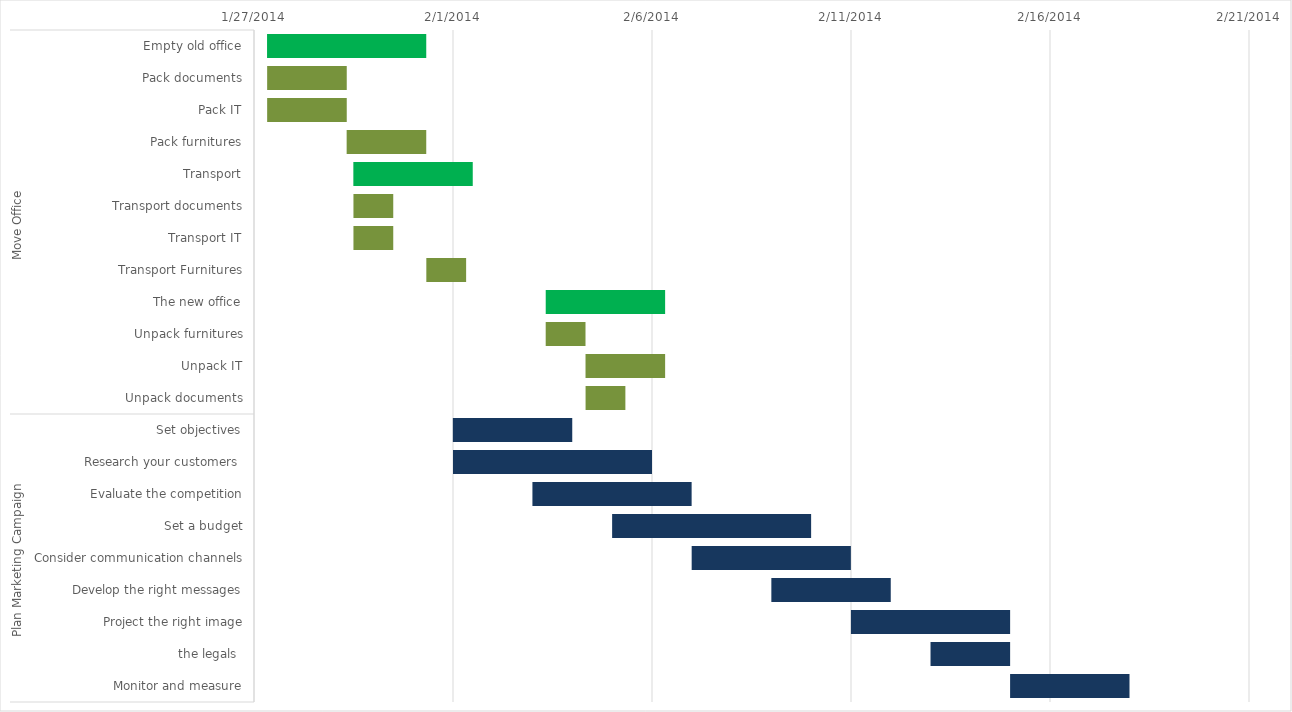
| Category | Start Date | duration |
|---|---|---|
| 0 | 1/27/14 | 4 |
| 1 | 1/27/14 | 2 |
| 2 | 1/27/14 | 2 |
| 3 | 1/29/14 | 2 |
| 4 | 1/29/14 | 3 |
| 5 | 1/29/14 | 1 |
| 6 | 1/29/14 | 1 |
| 7 | 1/31/14 | 1 |
| 8 | 2/3/14 | 3 |
| 9 | 2/3/14 | 1 |
| 10 | 2/4/14 | 2 |
| 11 | 2/4/14 | 1 |
| 12 | 2/1/14 | 3 |
| 13 | 2/1/14 | 5 |
| 14 | 2/3/14 | 4 |
| 15 | 2/5/14 | 5 |
| 16 | 2/7/14 | 4 |
| 17 | 2/9/14 | 3 |
| 18 | 2/11/14 | 4 |
| 19 | 2/13/14 | 2 |
| 20 | 2/15/14 | 3 |